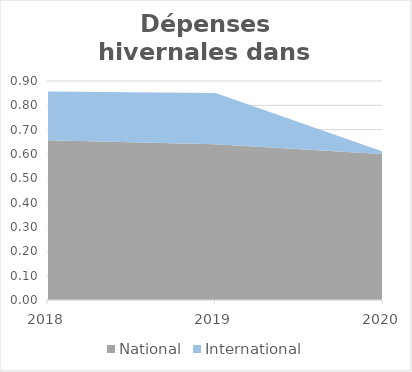
| Category | National | International |
|---|---|---|
| 2018.0 | 0.656 | 0.2 |
| 2019.0 | 0.64 | 0.21 |
| 2020.0 | 0.6 | 0.01 |